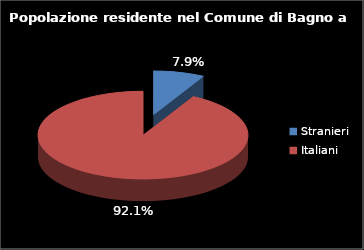
| Category | Series 0 |
|---|---|
| Stranieri | 2020 |
| Italiani | 23591 |